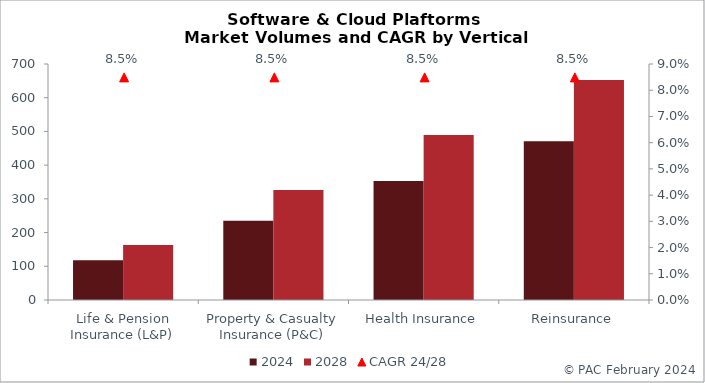
| Category | 2024 | 2028 |
|---|---|---|
| Life & Pension Insurance (L&P) | 117.7 | 163.053 |
| Property & Casualty Insurance (P&C) | 235.4 | 326.106 |
| Health Insurance | 353.1 | 489.16 |
| Reinsurance | 470.8 | 652.213 |